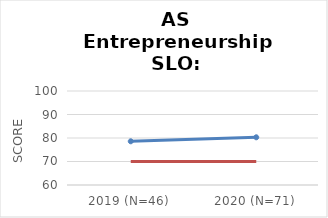
| Category | Series 0 | Series 1 |
|---|---|---|
| 2019 (N=46) | 78.6 | 70 |
| 2020 (N=71) | 80.3 | 70 |